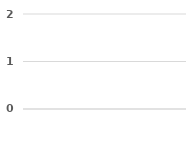
| Category | Series 0 | Series 1 | Series 2 |
|---|---|---|---|
|  | 0 | 0 | 0 |
|  | 0 | 0 | 0 |
|  | 0 | 0 | 0 |
|  | 0 | 0 | 0 |
|  | 0 | 0 | 0 |
|  | 0 | 0 | 0 |
|  | 0 | 0 | 0 |
|  | 0 | 0 | 0 |